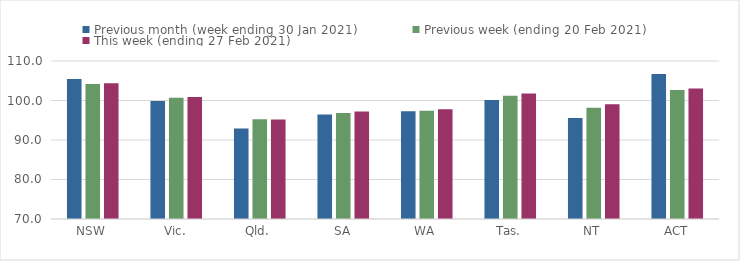
| Category | Previous month (week ending 30 Jan 2021) | Previous week (ending 20 Feb 2021) | This week (ending 27 Feb 2021) |
|---|---|---|---|
| NSW | 105.45 | 104.18 | 104.36 |
| Vic. | 99.85 | 100.72 | 100.87 |
| Qld. | 92.88 | 95.24 | 95.17 |
| SA | 96.43 | 96.82 | 97.24 |
| WA | 97.31 | 97.38 | 97.79 |
| Tas. | 100.15 | 101.2 | 101.76 |
| NT | 95.56 | 98.18 | 99.03 |
| ACT | 106.71 | 102.68 | 103.03 |